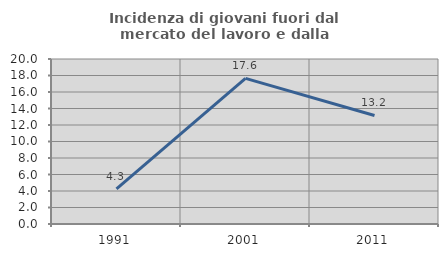
| Category | Incidenza di giovani fuori dal mercato del lavoro e dalla formazione  |
|---|---|
| 1991.0 | 4.255 |
| 2001.0 | 17.647 |
| 2011.0 | 13.158 |